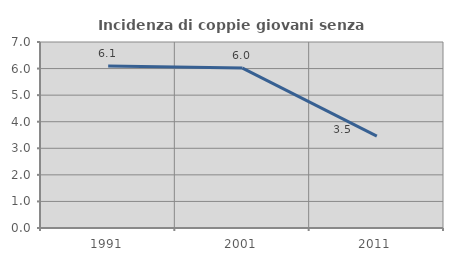
| Category | Incidenza di coppie giovani senza figli |
|---|---|
| 1991.0 | 6.1 |
| 2001.0 | 6.02 |
| 2011.0 | 3.46 |